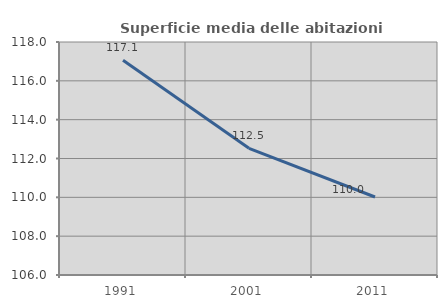
| Category | Superficie media delle abitazioni occupate |
|---|---|
| 1991.0 | 117.06 |
| 2001.0 | 112.526 |
| 2011.0 | 110.017 |